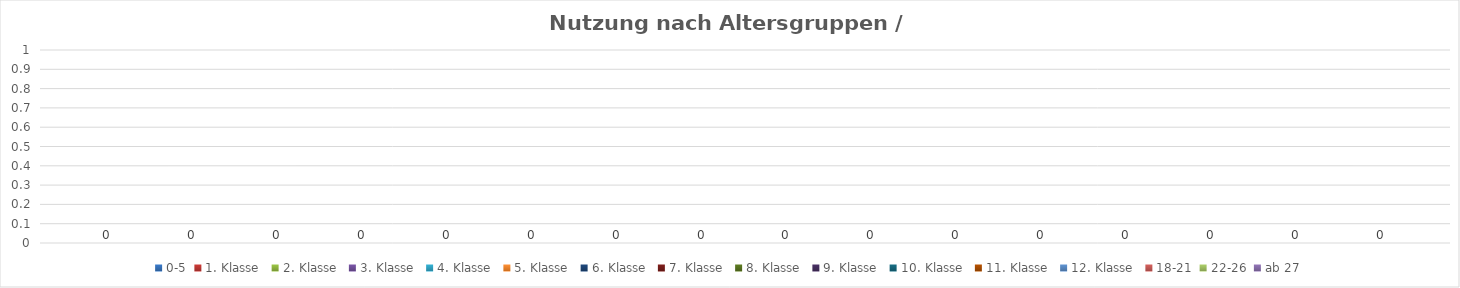
| Category | 0-5 | 1. Klasse  | 2. Klasse  | 3. Klasse  | 4. Klasse  | 5. Klasse  | 6. Klasse  | 7. Klasse  | 8. Klasse  | 9. Klasse  | 10. Klasse  | 11. Klasse  | 12. Klasse  | 18-21 | 22-26 | ab 27 |
|---|---|---|---|---|---|---|---|---|---|---|---|---|---|---|---|---|
| 0 | 0 | 0 | 0 | 0 | 0 | 0 | 0 | 0 | 0 | 0 | 0 | 0 | 0 | 0 | 0 | 0 |